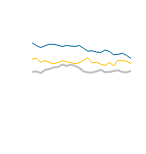
| Category | Item1 | Item2 | Item3 |
|---|---|---|---|
| 0 | 8278 | 5489 | 6704 |
| 1 | 8017 | 5536 | 6811 |
| 2 | 7828 | 5377 | 6410 |
| 3 | 8002 | 5680 | 6575 |
| 4 | 8145 | 5772 | 6420 |
| 5 | 8143 | 5924 | 6258 |
| 6 | 8053 | 5962 | 6404 |
| 7 | 7930 | 6200 | 6564 |
| 8 | 8032 | 6067 | 6455 |
| 9 | 7975 | 6188 | 6401 |
| 10 | 7940 | 6073 | 6282 |
| 11 | 8023 | 5876 | 6395 |
| 12 | 7754 | 5544 | 6627 |
| 13 | 7481 | 5434 | 6847 |
| 14 | 7521 | 5427 | 6363 |
| 15 | 7393 | 5543 | 6429 |
| 16 | 7358 | 5688 | 6232 |
| 17 | 7599 | 5467 | 6119 |
| 18 | 7452 | 5472 | 6397 |
| 19 | 7142 | 5579 | 6066 |
| 20 | 7174 | 5644 | 6618 |
| 21 | 7284 | 5484 | 6571 |
| 22 | 7081 | 5439 | 6517 |
| 23 | 6787 | 5595 | 6287 |